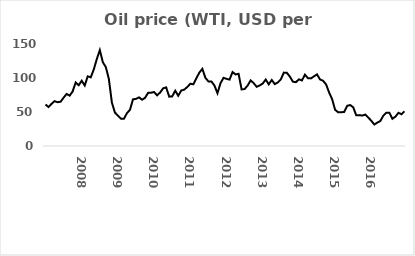
| Category | Series 0 |
|---|---|
| nan | 61.06 |
| nan | 57.31 |
| nan | 62.01 |
| nan | 65.95 |
| nan | 64.41 |
| nan | 65.09 |
| nan | 71.1 |
| nan | 76.54 |
| nan | 74.05 |
| nan | 80.25 |
| nan | 93.49 |
| nan | 89.32 |
| 2008.0 | 96.01 |
| nan | 88.97 |
| nan | 102.46 |
| nan | 100.98 |
| nan | 112.52 |
| nan | 127.76 |
| nan | 140.97 |
| nan | 123.26 |
| nan | 115.96 |
| nan | 98.53 |
| nan | 63.91 |
| nan | 49.28 |
| 2009.0 | 44.6 |
| nan | 40.08 |
| nan | 40.15 |
| nan | 48.39 |
| nan | 53.2 |
| nan | 68.58 |
| nan | 69.31 |
| nan | 71.58 |
| nan | 68.05 |
| nan | 70.82 |
| nan | 78.13 |
| nan | 78.37 |
| 2010.0 | 79.36 |
| nan | 74.43 |
| nan | 78.7 |
| nan | 84.87 |
| nan | 86.19 |
| nan | 72.58 |
| nan | 72.95 |
| nan | 81.34 |
| nan | 73.91 |
| nan | 81.58 |
| nan | 82.95 |
| nan | 86.75 |
| 2011.0 | 91.55 |
| nan | 90.77 |
| nan | 99.63 |
| nan | 107.94 |
| nan | 113.52 |
| nan | 100.29 |
| nan | 94.94 |
| nan | 94.89 |
| nan | 88.93 |
| nan | 77.61 |
| nan | 92.19 |
| nan | 100.2 |
| 2012.0 | 98.83 |
| nan | 97.61 |
| nan | 108.76 |
| nan | 105.23 |
| nan | 106.16 |
| nan | 83.23 |
| nan | 83.75 |
| nan | 88.91 |
| nan | 96.47 |
| nan | 92.48 |
| nan | 87.09 |
| nan | 89.09 |
| 2013.0 | 91.82 |
| nan | 97.77 |
| nan | 90.68 |
| nan | 97.07 |
| nan | 91.03 |
| nan | 93.45 |
| nan | 97.89 |
| nan | 107.92 |
| nan | 107.65 |
| nan | 102.08 |
| nan | 94.61 |
| nan | 93.82 |
| 2014.0 | 98.04 |
| nan | 96.43 |
| nan | 104.92 |
| nan | 99.74 |
| nan | 99.42 |
| nan | 102.47 |
| nan | 105.34 |
| nan | 97.88 |
| nan | 95.96 |
| nan | 90.73 |
| nan | 78.78 |
| nan | 69 |
| 2015.0 | 53.27 |
| nan | 49.57 |
| nan | 49.59 |
| nan | 50.09 |
| nan | 59.15 |
| nan | 60.2 |
| nan | 56.96 |
| nan | 45.17 |
| nan | 45.41 |
| nan | 44.74 |
| nan | 46.14 |
| nan | 41.85 |
| 2016.0 | 37.04 |
| nan | 31.62 |
| nan | 34.4 |
| nan | 36.79 |
| nan | 44.78 |
| nan | 49.01 |
| nan | 48.99 |
| nan | 40.06 |
| nan | 43.16 |
| nan | 48.81 |
| nan | 46.67 |
| nan | 51.06 |